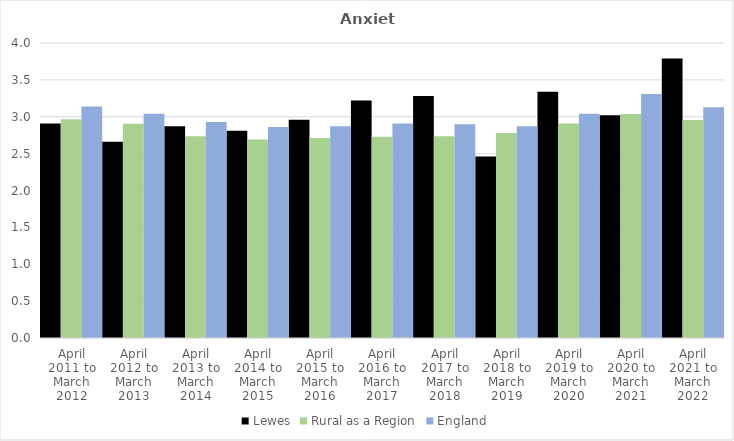
| Category | Lewes | Rural as a Region | England |
|---|---|---|---|
| April 2011 to March 2012 | 2.91 | 2.967 | 3.14 |
| April 2012 to March 2013 | 2.66 | 2.904 | 3.04 |
| April 2013 to March 2014 | 2.87 | 2.734 | 2.93 |
| April 2014 to March 2015 | 2.81 | 2.691 | 2.86 |
| April 2015 to March 2016 | 2.96 | 2.711 | 2.87 |
| April 2016 to March 2017 | 3.22 | 2.729 | 2.91 |
| April 2017 to March 2018 | 3.28 | 2.736 | 2.9 |
| April 2018 to March 2019 | 2.46 | 2.78 | 2.87 |
| April 2019 to March 2020 | 3.34 | 2.908 | 3.04 |
| April 2020 to March 2021 | 3.02 | 3.036 | 3.31 |
| April 2021 to March 2022 | 3.79 | 2.956 | 3.13 |